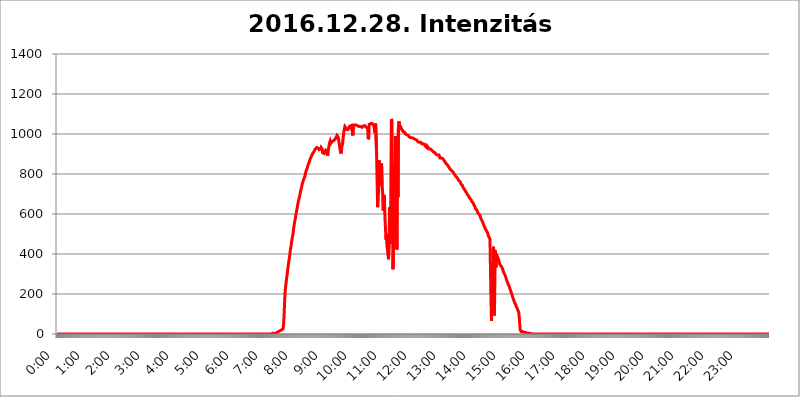
| Category | 2016.12.28. Intenzitás [W/m^2] |
|---|---|
| 0.0 | 0 |
| 0.0006944444444444445 | 0 |
| 0.001388888888888889 | 0 |
| 0.0020833333333333333 | 0 |
| 0.002777777777777778 | 0 |
| 0.003472222222222222 | 0 |
| 0.004166666666666667 | 0 |
| 0.004861111111111111 | 0 |
| 0.005555555555555556 | 0 |
| 0.0062499999999999995 | 0 |
| 0.006944444444444444 | 0 |
| 0.007638888888888889 | 0 |
| 0.008333333333333333 | 0 |
| 0.009027777777777779 | 0 |
| 0.009722222222222222 | 0 |
| 0.010416666666666666 | 0 |
| 0.011111111111111112 | 0 |
| 0.011805555555555555 | 0 |
| 0.012499999999999999 | 0 |
| 0.013194444444444444 | 0 |
| 0.013888888888888888 | 0 |
| 0.014583333333333332 | 0 |
| 0.015277777777777777 | 0 |
| 0.015972222222222224 | 0 |
| 0.016666666666666666 | 0 |
| 0.017361111111111112 | 0 |
| 0.018055555555555557 | 0 |
| 0.01875 | 0 |
| 0.019444444444444445 | 0 |
| 0.02013888888888889 | 0 |
| 0.020833333333333332 | 0 |
| 0.02152777777777778 | 0 |
| 0.022222222222222223 | 0 |
| 0.02291666666666667 | 0 |
| 0.02361111111111111 | 0 |
| 0.024305555555555556 | 0 |
| 0.024999999999999998 | 0 |
| 0.025694444444444447 | 0 |
| 0.02638888888888889 | 0 |
| 0.027083333333333334 | 0 |
| 0.027777777777777776 | 0 |
| 0.02847222222222222 | 0 |
| 0.029166666666666664 | 0 |
| 0.029861111111111113 | 0 |
| 0.030555555555555555 | 0 |
| 0.03125 | 0 |
| 0.03194444444444445 | 0 |
| 0.03263888888888889 | 0 |
| 0.03333333333333333 | 0 |
| 0.034027777777777775 | 0 |
| 0.034722222222222224 | 0 |
| 0.035416666666666666 | 0 |
| 0.036111111111111115 | 0 |
| 0.03680555555555556 | 0 |
| 0.0375 | 0 |
| 0.03819444444444444 | 0 |
| 0.03888888888888889 | 0 |
| 0.03958333333333333 | 0 |
| 0.04027777777777778 | 0 |
| 0.04097222222222222 | 0 |
| 0.041666666666666664 | 0 |
| 0.042361111111111106 | 0 |
| 0.04305555555555556 | 0 |
| 0.043750000000000004 | 0 |
| 0.044444444444444446 | 0 |
| 0.04513888888888889 | 0 |
| 0.04583333333333334 | 0 |
| 0.04652777777777778 | 0 |
| 0.04722222222222222 | 0 |
| 0.04791666666666666 | 0 |
| 0.04861111111111111 | 0 |
| 0.049305555555555554 | 0 |
| 0.049999999999999996 | 0 |
| 0.05069444444444445 | 0 |
| 0.051388888888888894 | 0 |
| 0.052083333333333336 | 0 |
| 0.05277777777777778 | 0 |
| 0.05347222222222222 | 0 |
| 0.05416666666666667 | 0 |
| 0.05486111111111111 | 0 |
| 0.05555555555555555 | 0 |
| 0.05625 | 0 |
| 0.05694444444444444 | 0 |
| 0.057638888888888885 | 0 |
| 0.05833333333333333 | 0 |
| 0.05902777777777778 | 0 |
| 0.059722222222222225 | 0 |
| 0.06041666666666667 | 0 |
| 0.061111111111111116 | 0 |
| 0.06180555555555556 | 0 |
| 0.0625 | 0 |
| 0.06319444444444444 | 0 |
| 0.06388888888888888 | 0 |
| 0.06458333333333334 | 0 |
| 0.06527777777777778 | 0 |
| 0.06597222222222222 | 0 |
| 0.06666666666666667 | 0 |
| 0.06736111111111111 | 0 |
| 0.06805555555555555 | 0 |
| 0.06874999999999999 | 0 |
| 0.06944444444444443 | 0 |
| 0.07013888888888889 | 0 |
| 0.07083333333333333 | 0 |
| 0.07152777777777779 | 0 |
| 0.07222222222222223 | 0 |
| 0.07291666666666667 | 0 |
| 0.07361111111111111 | 0 |
| 0.07430555555555556 | 0 |
| 0.075 | 0 |
| 0.07569444444444444 | 0 |
| 0.0763888888888889 | 0 |
| 0.07708333333333334 | 0 |
| 0.07777777777777778 | 0 |
| 0.07847222222222222 | 0 |
| 0.07916666666666666 | 0 |
| 0.0798611111111111 | 0 |
| 0.08055555555555556 | 0 |
| 0.08125 | 0 |
| 0.08194444444444444 | 0 |
| 0.08263888888888889 | 0 |
| 0.08333333333333333 | 0 |
| 0.08402777777777777 | 0 |
| 0.08472222222222221 | 0 |
| 0.08541666666666665 | 0 |
| 0.08611111111111112 | 0 |
| 0.08680555555555557 | 0 |
| 0.08750000000000001 | 0 |
| 0.08819444444444445 | 0 |
| 0.08888888888888889 | 0 |
| 0.08958333333333333 | 0 |
| 0.09027777777777778 | 0 |
| 0.09097222222222222 | 0 |
| 0.09166666666666667 | 0 |
| 0.09236111111111112 | 0 |
| 0.09305555555555556 | 0 |
| 0.09375 | 0 |
| 0.09444444444444444 | 0 |
| 0.09513888888888888 | 0 |
| 0.09583333333333333 | 0 |
| 0.09652777777777777 | 0 |
| 0.09722222222222222 | 0 |
| 0.09791666666666667 | 0 |
| 0.09861111111111111 | 0 |
| 0.09930555555555555 | 0 |
| 0.09999999999999999 | 0 |
| 0.10069444444444443 | 0 |
| 0.1013888888888889 | 0 |
| 0.10208333333333335 | 0 |
| 0.10277777777777779 | 0 |
| 0.10347222222222223 | 0 |
| 0.10416666666666667 | 0 |
| 0.10486111111111111 | 0 |
| 0.10555555555555556 | 0 |
| 0.10625 | 0 |
| 0.10694444444444444 | 0 |
| 0.1076388888888889 | 0 |
| 0.10833333333333334 | 0 |
| 0.10902777777777778 | 0 |
| 0.10972222222222222 | 0 |
| 0.1111111111111111 | 0 |
| 0.11180555555555556 | 0 |
| 0.11180555555555556 | 0 |
| 0.1125 | 0 |
| 0.11319444444444444 | 0 |
| 0.11388888888888889 | 0 |
| 0.11458333333333333 | 0 |
| 0.11527777777777777 | 0 |
| 0.11597222222222221 | 0 |
| 0.11666666666666665 | 0 |
| 0.1173611111111111 | 0 |
| 0.11805555555555557 | 0 |
| 0.11944444444444445 | 0 |
| 0.12013888888888889 | 0 |
| 0.12083333333333333 | 0 |
| 0.12152777777777778 | 0 |
| 0.12222222222222223 | 0 |
| 0.12291666666666667 | 0 |
| 0.12291666666666667 | 0 |
| 0.12361111111111112 | 0 |
| 0.12430555555555556 | 0 |
| 0.125 | 0 |
| 0.12569444444444444 | 0 |
| 0.12638888888888888 | 0 |
| 0.12708333333333333 | 0 |
| 0.16875 | 0 |
| 0.12847222222222224 | 0 |
| 0.12916666666666668 | 0 |
| 0.12986111111111112 | 0 |
| 0.13055555555555556 | 0 |
| 0.13125 | 0 |
| 0.13194444444444445 | 0 |
| 0.1326388888888889 | 0 |
| 0.13333333333333333 | 0 |
| 0.13402777777777777 | 0 |
| 0.13402777777777777 | 0 |
| 0.13472222222222222 | 0 |
| 0.13541666666666666 | 0 |
| 0.1361111111111111 | 0 |
| 0.13749999999999998 | 0 |
| 0.13819444444444443 | 0 |
| 0.1388888888888889 | 0 |
| 0.13958333333333334 | 0 |
| 0.14027777777777778 | 0 |
| 0.14097222222222222 | 0 |
| 0.14166666666666666 | 0 |
| 0.1423611111111111 | 0 |
| 0.14305555555555557 | 0 |
| 0.14375000000000002 | 0 |
| 0.14444444444444446 | 0 |
| 0.1451388888888889 | 0 |
| 0.1451388888888889 | 0 |
| 0.14652777777777778 | 0 |
| 0.14722222222222223 | 0 |
| 0.14791666666666667 | 0 |
| 0.1486111111111111 | 0 |
| 0.14930555555555555 | 0 |
| 0.15 | 0 |
| 0.15069444444444444 | 0 |
| 0.15138888888888888 | 0 |
| 0.15208333333333332 | 0 |
| 0.15277777777777776 | 0 |
| 0.15347222222222223 | 0 |
| 0.15416666666666667 | 0 |
| 0.15486111111111112 | 0 |
| 0.15555555555555556 | 0 |
| 0.15625 | 0 |
| 0.15694444444444444 | 0 |
| 0.15763888888888888 | 0 |
| 0.15833333333333333 | 0 |
| 0.15902777777777777 | 0 |
| 0.15972222222222224 | 0 |
| 0.16041666666666668 | 0 |
| 0.16111111111111112 | 0 |
| 0.16180555555555556 | 0 |
| 0.1625 | 0 |
| 0.16319444444444445 | 0 |
| 0.1638888888888889 | 0 |
| 0.16458333333333333 | 0 |
| 0.16527777777777777 | 0 |
| 0.16597222222222222 | 0 |
| 0.16666666666666666 | 0 |
| 0.1673611111111111 | 0 |
| 0.16805555555555554 | 0 |
| 0.16874999999999998 | 0 |
| 0.16944444444444443 | 0 |
| 0.17013888888888887 | 0 |
| 0.1708333333333333 | 0 |
| 0.17152777777777775 | 0 |
| 0.17222222222222225 | 0 |
| 0.1729166666666667 | 0 |
| 0.17361111111111113 | 0 |
| 0.17430555555555557 | 0 |
| 0.17500000000000002 | 0 |
| 0.17569444444444446 | 0 |
| 0.1763888888888889 | 0 |
| 0.17708333333333334 | 0 |
| 0.17777777777777778 | 0 |
| 0.17847222222222223 | 0 |
| 0.17916666666666667 | 0 |
| 0.1798611111111111 | 0 |
| 0.18055555555555555 | 0 |
| 0.18125 | 0 |
| 0.18194444444444444 | 0 |
| 0.1826388888888889 | 0 |
| 0.18333333333333335 | 0 |
| 0.1840277777777778 | 0 |
| 0.18472222222222223 | 0 |
| 0.18541666666666667 | 0 |
| 0.18611111111111112 | 0 |
| 0.18680555555555556 | 0 |
| 0.1875 | 0 |
| 0.18819444444444444 | 0 |
| 0.18888888888888888 | 0 |
| 0.18958333333333333 | 0 |
| 0.19027777777777777 | 0 |
| 0.1909722222222222 | 0 |
| 0.19166666666666665 | 0 |
| 0.19236111111111112 | 0 |
| 0.19305555555555554 | 0 |
| 0.19375 | 0 |
| 0.19444444444444445 | 0 |
| 0.1951388888888889 | 0 |
| 0.19583333333333333 | 0 |
| 0.19652777777777777 | 0 |
| 0.19722222222222222 | 0 |
| 0.19791666666666666 | 0 |
| 0.1986111111111111 | 0 |
| 0.19930555555555554 | 0 |
| 0.19999999999999998 | 0 |
| 0.20069444444444443 | 0 |
| 0.20138888888888887 | 0 |
| 0.2020833333333333 | 0 |
| 0.2027777777777778 | 0 |
| 0.2034722222222222 | 0 |
| 0.2041666666666667 | 0 |
| 0.20486111111111113 | 0 |
| 0.20555555555555557 | 0 |
| 0.20625000000000002 | 0 |
| 0.20694444444444446 | 0 |
| 0.2076388888888889 | 0 |
| 0.20833333333333334 | 0 |
| 0.20902777777777778 | 0 |
| 0.20972222222222223 | 0 |
| 0.21041666666666667 | 0 |
| 0.2111111111111111 | 0 |
| 0.21180555555555555 | 0 |
| 0.2125 | 0 |
| 0.21319444444444444 | 0 |
| 0.2138888888888889 | 0 |
| 0.21458333333333335 | 0 |
| 0.2152777777777778 | 0 |
| 0.21597222222222223 | 0 |
| 0.21666666666666667 | 0 |
| 0.21736111111111112 | 0 |
| 0.21805555555555556 | 0 |
| 0.21875 | 0 |
| 0.21944444444444444 | 0 |
| 0.22013888888888888 | 0 |
| 0.22083333333333333 | 0 |
| 0.22152777777777777 | 0 |
| 0.2222222222222222 | 0 |
| 0.22291666666666665 | 0 |
| 0.2236111111111111 | 0 |
| 0.22430555555555556 | 0 |
| 0.225 | 0 |
| 0.22569444444444445 | 0 |
| 0.2263888888888889 | 0 |
| 0.22708333333333333 | 0 |
| 0.22777777777777777 | 0 |
| 0.22847222222222222 | 0 |
| 0.22916666666666666 | 0 |
| 0.2298611111111111 | 0 |
| 0.23055555555555554 | 0 |
| 0.23124999999999998 | 0 |
| 0.23194444444444443 | 0 |
| 0.23263888888888887 | 0 |
| 0.2333333333333333 | 0 |
| 0.2340277777777778 | 0 |
| 0.2347222222222222 | 0 |
| 0.2354166666666667 | 0 |
| 0.23611111111111113 | 0 |
| 0.23680555555555557 | 0 |
| 0.23750000000000002 | 0 |
| 0.23819444444444446 | 0 |
| 0.2388888888888889 | 0 |
| 0.23958333333333334 | 0 |
| 0.24027777777777778 | 0 |
| 0.24097222222222223 | 0 |
| 0.24166666666666667 | 0 |
| 0.2423611111111111 | 0 |
| 0.24305555555555555 | 0 |
| 0.24375 | 0 |
| 0.24444444444444446 | 0 |
| 0.24513888888888888 | 0 |
| 0.24583333333333335 | 0 |
| 0.2465277777777778 | 0 |
| 0.24722222222222223 | 0 |
| 0.24791666666666667 | 0 |
| 0.24861111111111112 | 0 |
| 0.24930555555555556 | 0 |
| 0.25 | 0 |
| 0.25069444444444444 | 0 |
| 0.2513888888888889 | 0 |
| 0.2520833333333333 | 0 |
| 0.25277777777777777 | 0 |
| 0.2534722222222222 | 0 |
| 0.25416666666666665 | 0 |
| 0.2548611111111111 | 0 |
| 0.2555555555555556 | 0 |
| 0.25625000000000003 | 0 |
| 0.2569444444444445 | 0 |
| 0.2576388888888889 | 0 |
| 0.25833333333333336 | 0 |
| 0.2590277777777778 | 0 |
| 0.25972222222222224 | 0 |
| 0.2604166666666667 | 0 |
| 0.2611111111111111 | 0 |
| 0.26180555555555557 | 0 |
| 0.2625 | 0 |
| 0.26319444444444445 | 0 |
| 0.2638888888888889 | 0 |
| 0.26458333333333334 | 0 |
| 0.2652777777777778 | 0 |
| 0.2659722222222222 | 0 |
| 0.26666666666666666 | 0 |
| 0.2673611111111111 | 0 |
| 0.26805555555555555 | 0 |
| 0.26875 | 0 |
| 0.26944444444444443 | 0 |
| 0.2701388888888889 | 0 |
| 0.2708333333333333 | 0 |
| 0.27152777777777776 | 0 |
| 0.2722222222222222 | 0 |
| 0.27291666666666664 | 0 |
| 0.2736111111111111 | 0 |
| 0.2743055555555555 | 0 |
| 0.27499999999999997 | 0 |
| 0.27569444444444446 | 0 |
| 0.27638888888888885 | 0 |
| 0.27708333333333335 | 0 |
| 0.2777777777777778 | 0 |
| 0.27847222222222223 | 0 |
| 0.2791666666666667 | 0 |
| 0.2798611111111111 | 0 |
| 0.28055555555555556 | 0 |
| 0.28125 | 0 |
| 0.28194444444444444 | 0 |
| 0.2826388888888889 | 0 |
| 0.2833333333333333 | 0 |
| 0.28402777777777777 | 0 |
| 0.2847222222222222 | 0 |
| 0.28541666666666665 | 0 |
| 0.28611111111111115 | 0 |
| 0.28680555555555554 | 0 |
| 0.28750000000000003 | 0 |
| 0.2881944444444445 | 0 |
| 0.2888888888888889 | 0 |
| 0.28958333333333336 | 0 |
| 0.2902777777777778 | 0 |
| 0.29097222222222224 | 0 |
| 0.2916666666666667 | 0 |
| 0.2923611111111111 | 0 |
| 0.29305555555555557 | 0 |
| 0.29375 | 0 |
| 0.29444444444444445 | 0 |
| 0.2951388888888889 | 0 |
| 0.29583333333333334 | 0 |
| 0.2965277777777778 | 0 |
| 0.2972222222222222 | 0 |
| 0.29791666666666666 | 0 |
| 0.2986111111111111 | 0 |
| 0.29930555555555555 | 0 |
| 0.3 | 0 |
| 0.30069444444444443 | 3.525 |
| 0.3013888888888889 | 3.525 |
| 0.3020833333333333 | 3.525 |
| 0.30277777777777776 | 3.525 |
| 0.3034722222222222 | 3.525 |
| 0.30416666666666664 | 3.525 |
| 0.3048611111111111 | 3.525 |
| 0.3055555555555555 | 3.525 |
| 0.30624999999999997 | 3.525 |
| 0.3069444444444444 | 3.525 |
| 0.3076388888888889 | 7.887 |
| 0.30833333333333335 | 7.887 |
| 0.3090277777777778 | 7.887 |
| 0.30972222222222223 | 12.257 |
| 0.3104166666666667 | 12.257 |
| 0.3111111111111111 | 12.257 |
| 0.31180555555555556 | 12.257 |
| 0.3125 | 16.636 |
| 0.31319444444444444 | 16.636 |
| 0.3138888888888889 | 21.024 |
| 0.3145833333333333 | 21.024 |
| 0.31527777777777777 | 21.024 |
| 0.3159722222222222 | 25.419 |
| 0.31666666666666665 | 25.419 |
| 0.31736111111111115 | 43.079 |
| 0.31805555555555554 | 87.692 |
| 0.31875000000000003 | 146.423 |
| 0.3194444444444445 | 201.058 |
| 0.3201388888888889 | 233 |
| 0.32083333333333336 | 251.251 |
| 0.3215277777777778 | 274.047 |
| 0.32222222222222224 | 292.259 |
| 0.3229166666666667 | 310.44 |
| 0.3236111111111111 | 333.113 |
| 0.32430555555555557 | 351.198 |
| 0.325 | 369.23 |
| 0.32569444444444445 | 382.715 |
| 0.3263888888888889 | 405.108 |
| 0.32708333333333334 | 422.943 |
| 0.3277777777777778 | 436.27 |
| 0.3284722222222222 | 453.968 |
| 0.32916666666666666 | 471.582 |
| 0.3298611111111111 | 484.735 |
| 0.33055555555555555 | 497.836 |
| 0.33125 | 519.555 |
| 0.33194444444444443 | 536.82 |
| 0.3326388888888889 | 553.986 |
| 0.3333333333333333 | 566.793 |
| 0.3340277777777778 | 579.542 |
| 0.3347222222222222 | 596.45 |
| 0.3354166666666667 | 609.062 |
| 0.3361111111111111 | 621.613 |
| 0.3368055555555556 | 638.256 |
| 0.33749999999999997 | 650.667 |
| 0.33819444444444446 | 663.019 |
| 0.33888888888888885 | 675.311 |
| 0.33958333333333335 | 683.473 |
| 0.34027777777777773 | 695.666 |
| 0.34097222222222223 | 707.8 |
| 0.3416666666666666 | 719.877 |
| 0.3423611111111111 | 727.896 |
| 0.3430555555555555 | 739.877 |
| 0.34375 | 751.803 |
| 0.3444444444444445 | 759.723 |
| 0.3451388888888889 | 767.62 |
| 0.3458333333333334 | 775.492 |
| 0.34652777777777777 | 779.42 |
| 0.34722222222222227 | 787.258 |
| 0.34791666666666665 | 798.974 |
| 0.34861111111111115 | 810.641 |
| 0.34930555555555554 | 818.392 |
| 0.35000000000000003 | 822.26 |
| 0.3506944444444444 | 829.981 |
| 0.3513888888888889 | 841.526 |
| 0.3520833333333333 | 849.199 |
| 0.3527777777777778 | 853.029 |
| 0.3534722222222222 | 860.676 |
| 0.3541666666666667 | 868.305 |
| 0.3548611111111111 | 875.918 |
| 0.35555555555555557 | 879.719 |
| 0.35625 | 887.309 |
| 0.35694444444444445 | 891.099 |
| 0.3576388888888889 | 898.668 |
| 0.35833333333333334 | 902.447 |
| 0.3590277777777778 | 906.223 |
| 0.3597222222222222 | 909.996 |
| 0.36041666666666666 | 913.766 |
| 0.3611111111111111 | 913.766 |
| 0.36180555555555555 | 925.06 |
| 0.3625 | 925.06 |
| 0.36319444444444443 | 925.06 |
| 0.3638888888888889 | 932.576 |
| 0.3645833333333333 | 928.819 |
| 0.3652777777777778 | 932.576 |
| 0.3659722222222222 | 928.819 |
| 0.3666666666666667 | 925.06 |
| 0.3673611111111111 | 921.298 |
| 0.3680555555555556 | 917.534 |
| 0.36874999999999997 | 921.298 |
| 0.36944444444444446 | 925.06 |
| 0.37013888888888885 | 932.576 |
| 0.37083333333333335 | 928.819 |
| 0.37152777777777773 | 925.06 |
| 0.37222222222222223 | 906.223 |
| 0.3729166666666666 | 909.996 |
| 0.3736111111111111 | 906.223 |
| 0.3743055555555555 | 902.447 |
| 0.375 | 898.668 |
| 0.3756944444444445 | 906.223 |
| 0.3763888888888889 | 917.534 |
| 0.3770833333333334 | 921.298 |
| 0.37777777777777777 | 921.298 |
| 0.37847222222222227 | 906.223 |
| 0.37916666666666665 | 891.099 |
| 0.37986111111111115 | 909.996 |
| 0.38055555555555554 | 928.819 |
| 0.38125000000000003 | 928.819 |
| 0.3819444444444444 | 955.071 |
| 0.3826388888888889 | 962.555 |
| 0.3833333333333333 | 951.327 |
| 0.3840277777777778 | 947.58 |
| 0.3847222222222222 | 955.071 |
| 0.3854166666666667 | 962.555 |
| 0.3861111111111111 | 966.295 |
| 0.38680555555555557 | 966.295 |
| 0.3875 | 966.295 |
| 0.38819444444444445 | 966.295 |
| 0.3888888888888889 | 970.034 |
| 0.38958333333333334 | 973.772 |
| 0.3902777777777778 | 977.508 |
| 0.3909722222222222 | 981.244 |
| 0.39166666666666666 | 984.98 |
| 0.3923611111111111 | 992.448 |
| 0.39305555555555555 | 992.448 |
| 0.39375 | 984.98 |
| 0.39444444444444443 | 977.508 |
| 0.3951388888888889 | 958.814 |
| 0.3958333333333333 | 943.832 |
| 0.3965277777777778 | 925.06 |
| 0.3972222222222222 | 909.996 |
| 0.3979166666666667 | 902.447 |
| 0.3986111111111111 | 917.534 |
| 0.3993055555555556 | 940.082 |
| 0.39999999999999997 | 947.58 |
| 0.40069444444444446 | 970.034 |
| 0.40138888888888885 | 992.448 |
| 0.40208333333333335 | 1014.852 |
| 0.40277777777777773 | 1026.06 |
| 0.40347222222222223 | 1037.277 |
| 0.4041666666666666 | 1041.019 |
| 0.4048611111111111 | 1029.798 |
| 0.4055555555555555 | 1022.323 |
| 0.40625 | 1022.323 |
| 0.4069444444444445 | 1022.323 |
| 0.4076388888888889 | 1022.323 |
| 0.4083333333333334 | 1022.323 |
| 0.40902777777777777 | 1026.06 |
| 0.40972222222222227 | 1037.277 |
| 0.41041666666666665 | 1037.277 |
| 0.41111111111111115 | 1037.277 |
| 0.41180555555555554 | 1041.019 |
| 0.41250000000000003 | 1037.277 |
| 0.4131944444444444 | 1044.762 |
| 0.4138888888888889 | 1011.118 |
| 0.4145833333333333 | 992.448 |
| 0.4152777777777778 | 1044.762 |
| 0.4159722222222222 | 1048.508 |
| 0.4166666666666667 | 1048.508 |
| 0.4173611111111111 | 1044.762 |
| 0.41805555555555557 | 1044.762 |
| 0.41875 | 1044.762 |
| 0.41944444444444445 | 1044.762 |
| 0.4201388888888889 | 1044.762 |
| 0.42083333333333334 | 1041.019 |
| 0.4215277777777778 | 1041.019 |
| 0.4222222222222222 | 1037.277 |
| 0.42291666666666666 | 1037.277 |
| 0.4236111111111111 | 1037.277 |
| 0.42430555555555555 | 1033.537 |
| 0.425 | 1033.537 |
| 0.42569444444444443 | 1037.277 |
| 0.4263888888888889 | 1037.277 |
| 0.4270833333333333 | 1033.537 |
| 0.4277777777777778 | 1033.537 |
| 0.4284722222222222 | 1037.277 |
| 0.4291666666666667 | 1037.277 |
| 0.4298611111111111 | 1041.019 |
| 0.4305555555555556 | 1037.277 |
| 0.43124999999999997 | 1044.762 |
| 0.43194444444444446 | 1041.019 |
| 0.43263888888888885 | 1037.277 |
| 0.43333333333333335 | 1033.537 |
| 0.43402777777777773 | 1037.277 |
| 0.43472222222222223 | 1037.277 |
| 0.4354166666666666 | 1029.798 |
| 0.4361111111111111 | 973.772 |
| 0.4368055555555555 | 981.244 |
| 0.4375 | 1048.508 |
| 0.4381944444444445 | 1044.762 |
| 0.4388888888888889 | 1044.762 |
| 0.4395833333333334 | 1052.255 |
| 0.44027777777777777 | 1056.004 |
| 0.44097222222222227 | 1052.255 |
| 0.44166666666666665 | 1052.255 |
| 0.44236111111111115 | 1052.255 |
| 0.44305555555555554 | 1044.762 |
| 0.44375000000000003 | 1048.508 |
| 0.4444444444444444 | 1037.277 |
| 0.4451388888888889 | 1007.383 |
| 0.4458333333333333 | 1037.277 |
| 0.4465277777777778 | 1052.255 |
| 0.4472222222222222 | 1052.255 |
| 0.4479166666666667 | 902.447 |
| 0.4486111111111111 | 759.723 |
| 0.44930555555555557 | 634.105 |
| 0.45 | 683.473 |
| 0.45069444444444445 | 711.832 |
| 0.4513888888888889 | 868.305 |
| 0.45208333333333334 | 845.365 |
| 0.4527777777777778 | 833.834 |
| 0.4534722222222222 | 739.877 |
| 0.45416666666666666 | 779.42 |
| 0.4548611111111111 | 853.029 |
| 0.45555555555555555 | 747.834 |
| 0.45625 | 715.858 |
| 0.45694444444444443 | 617.436 |
| 0.4576388888888889 | 625.784 |
| 0.4583333333333333 | 695.666 |
| 0.4590277777777778 | 658.909 |
| 0.4597222222222222 | 575.299 |
| 0.4604166666666667 | 523.88 |
| 0.4611111111111111 | 471.582 |
| 0.4618055555555556 | 497.836 |
| 0.46249999999999997 | 497.836 |
| 0.46319444444444446 | 418.492 |
| 0.46388888888888885 | 396.164 |
| 0.46458333333333335 | 373.729 |
| 0.46527777777777773 | 445.129 |
| 0.46597222222222223 | 634.105 |
| 0.4666666666666666 | 449.551 |
| 0.4673611111111111 | 629.948 |
| 0.4680555555555555 | 609.062 |
| 0.46875 | 1074.789 |
| 0.4694444444444445 | 1067.267 |
| 0.4701388888888889 | 642.4 |
| 0.4708333333333334 | 324.052 |
| 0.47152777777777777 | 409.574 |
| 0.47222222222222227 | 497.836 |
| 0.47291666666666665 | 841.526 |
| 0.47361111111111115 | 743.859 |
| 0.47430555555555554 | 988.714 |
| 0.47500000000000003 | 909.996 |
| 0.4756944444444444 | 545.416 |
| 0.4763888888888889 | 422.943 |
| 0.4770833333333333 | 970.034 |
| 0.4777777777777778 | 683.473 |
| 0.4784722222222222 | 1029.798 |
| 0.4791666666666667 | 1063.51 |
| 0.4798611111111111 | 1048.508 |
| 0.48055555555555557 | 1041.019 |
| 0.48125 | 1037.277 |
| 0.48194444444444445 | 1033.537 |
| 0.4826388888888889 | 1026.06 |
| 0.48333333333333334 | 1022.323 |
| 0.4840277777777778 | 1018.587 |
| 0.4847222222222222 | 1014.852 |
| 0.48541666666666666 | 1011.118 |
| 0.4861111111111111 | 1007.383 |
| 0.48680555555555555 | 1007.383 |
| 0.4875 | 1007.383 |
| 0.48819444444444443 | 999.916 |
| 0.4888888888888889 | 996.182 |
| 0.4895833333333333 | 996.182 |
| 0.4902777777777778 | 996.182 |
| 0.4909722222222222 | 992.448 |
| 0.4916666666666667 | 992.448 |
| 0.4923611111111111 | 992.448 |
| 0.4930555555555556 | 988.714 |
| 0.49374999999999997 | 984.98 |
| 0.49444444444444446 | 984.98 |
| 0.49513888888888885 | 984.98 |
| 0.49583333333333335 | 981.244 |
| 0.49652777777777773 | 981.244 |
| 0.49722222222222223 | 981.244 |
| 0.4979166666666666 | 981.244 |
| 0.4986111111111111 | 977.508 |
| 0.4993055555555555 | 977.508 |
| 0.5 | 977.508 |
| 0.5006944444444444 | 973.772 |
| 0.5013888888888889 | 977.508 |
| 0.5020833333333333 | 973.772 |
| 0.5027777777777778 | 970.034 |
| 0.5034722222222222 | 970.034 |
| 0.5041666666666667 | 970.034 |
| 0.5048611111111111 | 966.295 |
| 0.5055555555555555 | 962.555 |
| 0.50625 | 958.814 |
| 0.5069444444444444 | 958.814 |
| 0.5076388888888889 | 958.814 |
| 0.5083333333333333 | 958.814 |
| 0.5090277777777777 | 962.555 |
| 0.5097222222222222 | 958.814 |
| 0.5104166666666666 | 955.071 |
| 0.5111111111111112 | 951.327 |
| 0.5118055555555555 | 951.327 |
| 0.5125000000000001 | 951.327 |
| 0.5131944444444444 | 951.327 |
| 0.513888888888889 | 951.327 |
| 0.5145833333333333 | 947.58 |
| 0.5152777777777778 | 947.58 |
| 0.5159722222222222 | 940.082 |
| 0.5166666666666667 | 940.082 |
| 0.517361111111111 | 936.33 |
| 0.5180555555555556 | 932.576 |
| 0.5187499999999999 | 940.082 |
| 0.5194444444444445 | 940.082 |
| 0.5201388888888888 | 932.576 |
| 0.5208333333333334 | 928.819 |
| 0.5215277777777778 | 925.06 |
| 0.5222222222222223 | 925.06 |
| 0.5229166666666667 | 925.06 |
| 0.5236111111111111 | 925.06 |
| 0.5243055555555556 | 928.819 |
| 0.525 | 925.06 |
| 0.5256944444444445 | 917.534 |
| 0.5263888888888889 | 913.766 |
| 0.5270833333333333 | 913.766 |
| 0.5277777777777778 | 909.996 |
| 0.5284722222222222 | 909.996 |
| 0.5291666666666667 | 913.766 |
| 0.5298611111111111 | 906.223 |
| 0.5305555555555556 | 902.447 |
| 0.53125 | 898.668 |
| 0.5319444444444444 | 902.447 |
| 0.5326388888888889 | 894.885 |
| 0.5333333333333333 | 894.885 |
| 0.5340277777777778 | 891.099 |
| 0.5347222222222222 | 894.885 |
| 0.5354166666666667 | 894.885 |
| 0.5361111111111111 | 887.309 |
| 0.5368055555555555 | 879.719 |
| 0.5375 | 879.719 |
| 0.5381944444444444 | 879.719 |
| 0.5388888888888889 | 879.719 |
| 0.5395833333333333 | 875.918 |
| 0.5402777777777777 | 875.918 |
| 0.5409722222222222 | 875.918 |
| 0.5416666666666666 | 872.114 |
| 0.5423611111111112 | 868.305 |
| 0.5430555555555555 | 864.493 |
| 0.5437500000000001 | 860.676 |
| 0.5444444444444444 | 856.855 |
| 0.545138888888889 | 853.029 |
| 0.5458333333333333 | 853.029 |
| 0.5465277777777778 | 849.199 |
| 0.5472222222222222 | 845.365 |
| 0.5479166666666667 | 841.526 |
| 0.548611111111111 | 841.526 |
| 0.5493055555555556 | 833.834 |
| 0.5499999999999999 | 829.981 |
| 0.5506944444444445 | 826.123 |
| 0.5513888888888888 | 826.123 |
| 0.5520833333333334 | 822.26 |
| 0.5527777777777778 | 818.392 |
| 0.5534722222222223 | 814.519 |
| 0.5541666666666667 | 814.519 |
| 0.5548611111111111 | 810.641 |
| 0.5555555555555556 | 806.757 |
| 0.55625 | 802.868 |
| 0.5569444444444445 | 798.974 |
| 0.5576388888888889 | 798.974 |
| 0.5583333333333333 | 791.169 |
| 0.5590277777777778 | 787.258 |
| 0.5597222222222222 | 787.258 |
| 0.5604166666666667 | 783.342 |
| 0.5611111111111111 | 779.42 |
| 0.5618055555555556 | 775.492 |
| 0.5625 | 775.492 |
| 0.5631944444444444 | 767.62 |
| 0.5638888888888889 | 767.62 |
| 0.5645833333333333 | 763.674 |
| 0.5652777777777778 | 759.723 |
| 0.5659722222222222 | 751.803 |
| 0.5666666666666667 | 747.834 |
| 0.5673611111111111 | 747.834 |
| 0.5680555555555555 | 743.859 |
| 0.56875 | 735.89 |
| 0.5694444444444444 | 735.89 |
| 0.5701388888888889 | 727.896 |
| 0.5708333333333333 | 723.889 |
| 0.5715277777777777 | 719.877 |
| 0.5722222222222222 | 715.858 |
| 0.5729166666666666 | 711.832 |
| 0.5736111111111112 | 711.832 |
| 0.5743055555555555 | 703.762 |
| 0.5750000000000001 | 699.717 |
| 0.5756944444444444 | 695.666 |
| 0.576388888888889 | 691.608 |
| 0.5770833333333333 | 687.544 |
| 0.5777777777777778 | 683.473 |
| 0.5784722222222222 | 679.395 |
| 0.5791666666666667 | 675.311 |
| 0.579861111111111 | 675.311 |
| 0.5805555555555556 | 671.22 |
| 0.5812499999999999 | 663.019 |
| 0.5819444444444445 | 663.019 |
| 0.5826388888888888 | 658.909 |
| 0.5833333333333334 | 654.791 |
| 0.5840277777777778 | 650.667 |
| 0.5847222222222223 | 642.4 |
| 0.5854166666666667 | 638.256 |
| 0.5861111111111111 | 634.105 |
| 0.5868055555555556 | 625.784 |
| 0.5875 | 629.948 |
| 0.5881944444444445 | 625.784 |
| 0.5888888888888889 | 617.436 |
| 0.5895833333333333 | 609.062 |
| 0.5902777777777778 | 604.864 |
| 0.5909722222222222 | 600.661 |
| 0.5916666666666667 | 600.661 |
| 0.5923611111111111 | 600.661 |
| 0.5930555555555556 | 592.233 |
| 0.59375 | 579.542 |
| 0.5944444444444444 | 579.542 |
| 0.5951388888888889 | 575.299 |
| 0.5958333333333333 | 566.793 |
| 0.5965277777777778 | 562.53 |
| 0.5972222222222222 | 553.986 |
| 0.5979166666666667 | 545.416 |
| 0.5986111111111111 | 541.121 |
| 0.5993055555555555 | 536.82 |
| 0.6 | 528.2 |
| 0.6006944444444444 | 523.88 |
| 0.6013888888888889 | 523.88 |
| 0.6020833333333333 | 515.223 |
| 0.6027777777777777 | 510.885 |
| 0.6034722222222222 | 506.542 |
| 0.6041666666666666 | 502.192 |
| 0.6048611111111112 | 489.108 |
| 0.6055555555555555 | 489.108 |
| 0.6062500000000001 | 480.356 |
| 0.6069444444444444 | 471.582 |
| 0.607638888888889 | 467.187 |
| 0.6083333333333333 | 164.605 |
| 0.6090277777777778 | 65.31 |
| 0.6097222222222222 | 246.689 |
| 0.6104166666666667 | 160.056 |
| 0.611111111111111 | 278.603 |
| 0.6118055555555556 | 436.27 |
| 0.6124999999999999 | 400.638 |
| 0.6131944444444445 | 92.184 |
| 0.6138888888888888 | 418.492 |
| 0.6145833333333334 | 409.574 |
| 0.6152777777777778 | 333.113 |
| 0.6159722222222223 | 396.164 |
| 0.6166666666666667 | 391.685 |
| 0.6173611111111111 | 387.202 |
| 0.6180555555555556 | 382.715 |
| 0.61875 | 373.729 |
| 0.6194444444444445 | 364.728 |
| 0.6201388888888889 | 360.221 |
| 0.6208333333333333 | 346.682 |
| 0.6215277777777778 | 346.682 |
| 0.6222222222222222 | 342.162 |
| 0.6229166666666667 | 337.639 |
| 0.6236111111111111 | 333.113 |
| 0.6243055555555556 | 328.584 |
| 0.625 | 319.517 |
| 0.6256944444444444 | 314.98 |
| 0.6263888888888889 | 305.898 |
| 0.6270833333333333 | 305.898 |
| 0.6277777777777778 | 296.808 |
| 0.6284722222222222 | 292.259 |
| 0.6291666666666667 | 283.156 |
| 0.6298611111111111 | 274.047 |
| 0.6305555555555555 | 269.49 |
| 0.63125 | 260.373 |
| 0.6319444444444444 | 255.813 |
| 0.6326388888888889 | 246.689 |
| 0.6333333333333333 | 242.127 |
| 0.6340277777777777 | 237.564 |
| 0.6347222222222222 | 228.436 |
| 0.6354166666666666 | 223.873 |
| 0.6361111111111112 | 214.746 |
| 0.6368055555555555 | 205.62 |
| 0.6375000000000001 | 201.058 |
| 0.6381944444444444 | 191.937 |
| 0.638888888888889 | 182.82 |
| 0.6395833333333333 | 178.264 |
| 0.6402777777777778 | 169.156 |
| 0.6409722222222222 | 164.605 |
| 0.6416666666666667 | 155.509 |
| 0.642361111111111 | 150.964 |
| 0.6430555555555556 | 146.423 |
| 0.6437499999999999 | 137.347 |
| 0.6444444444444445 | 132.814 |
| 0.6451388888888888 | 128.284 |
| 0.6458333333333334 | 119.235 |
| 0.6465277777777778 | 114.716 |
| 0.6472222222222223 | 110.201 |
| 0.6479166666666667 | 87.692 |
| 0.6486111111111111 | 51.951 |
| 0.6493055555555556 | 21.024 |
| 0.65 | 16.636 |
| 0.6506944444444445 | 12.257 |
| 0.6513888888888889 | 12.257 |
| 0.6520833333333333 | 12.257 |
| 0.6527777777777778 | 12.257 |
| 0.6534722222222222 | 12.257 |
| 0.6541666666666667 | 12.257 |
| 0.6548611111111111 | 7.887 |
| 0.6555555555555556 | 7.887 |
| 0.65625 | 7.887 |
| 0.6569444444444444 | 7.887 |
| 0.6576388888888889 | 3.525 |
| 0.6583333333333333 | 3.525 |
| 0.6590277777777778 | 3.525 |
| 0.6597222222222222 | 3.525 |
| 0.6604166666666667 | 3.525 |
| 0.6611111111111111 | 3.525 |
| 0.6618055555555555 | 3.525 |
| 0.6625 | 0 |
| 0.6631944444444444 | 3.525 |
| 0.6638888888888889 | 3.525 |
| 0.6645833333333333 | 0 |
| 0.6652777777777777 | 0 |
| 0.6659722222222222 | 0 |
| 0.6666666666666666 | 0 |
| 0.6673611111111111 | 0 |
| 0.6680555555555556 | 0 |
| 0.6687500000000001 | 0 |
| 0.6694444444444444 | 0 |
| 0.6701388888888888 | 0 |
| 0.6708333333333334 | 0 |
| 0.6715277777777778 | 0 |
| 0.6722222222222222 | 0 |
| 0.6729166666666666 | 0 |
| 0.6736111111111112 | 0 |
| 0.6743055555555556 | 0 |
| 0.6749999999999999 | 0 |
| 0.6756944444444444 | 0 |
| 0.6763888888888889 | 0 |
| 0.6770833333333334 | 0 |
| 0.6777777777777777 | 0 |
| 0.6784722222222223 | 0 |
| 0.6791666666666667 | 0 |
| 0.6798611111111111 | 0 |
| 0.6805555555555555 | 0 |
| 0.68125 | 0 |
| 0.6819444444444445 | 0 |
| 0.6826388888888889 | 0 |
| 0.6833333333333332 | 0 |
| 0.6840277777777778 | 0 |
| 0.6847222222222222 | 0 |
| 0.6854166666666667 | 0 |
| 0.686111111111111 | 0 |
| 0.6868055555555556 | 0 |
| 0.6875 | 0 |
| 0.6881944444444444 | 0 |
| 0.688888888888889 | 0 |
| 0.6895833333333333 | 0 |
| 0.6902777777777778 | 0 |
| 0.6909722222222222 | 0 |
| 0.6916666666666668 | 0 |
| 0.6923611111111111 | 0 |
| 0.6930555555555555 | 0 |
| 0.69375 | 0 |
| 0.6944444444444445 | 0 |
| 0.6951388888888889 | 0 |
| 0.6958333333333333 | 0 |
| 0.6965277777777777 | 0 |
| 0.6972222222222223 | 0 |
| 0.6979166666666666 | 0 |
| 0.6986111111111111 | 0 |
| 0.6993055555555556 | 0 |
| 0.7000000000000001 | 0 |
| 0.7006944444444444 | 0 |
| 0.7013888888888888 | 0 |
| 0.7020833333333334 | 0 |
| 0.7027777777777778 | 0 |
| 0.7034722222222222 | 0 |
| 0.7041666666666666 | 0 |
| 0.7048611111111112 | 0 |
| 0.7055555555555556 | 0 |
| 0.7062499999999999 | 0 |
| 0.7069444444444444 | 0 |
| 0.7076388888888889 | 0 |
| 0.7083333333333334 | 0 |
| 0.7090277777777777 | 0 |
| 0.7097222222222223 | 0 |
| 0.7104166666666667 | 0 |
| 0.7111111111111111 | 0 |
| 0.7118055555555555 | 0 |
| 0.7125 | 0 |
| 0.7131944444444445 | 0 |
| 0.7138888888888889 | 0 |
| 0.7145833333333332 | 0 |
| 0.7152777777777778 | 0 |
| 0.7159722222222222 | 0 |
| 0.7166666666666667 | 0 |
| 0.717361111111111 | 0 |
| 0.7180555555555556 | 0 |
| 0.71875 | 0 |
| 0.7194444444444444 | 0 |
| 0.720138888888889 | 0 |
| 0.7208333333333333 | 0 |
| 0.7215277777777778 | 0 |
| 0.7222222222222222 | 0 |
| 0.7229166666666668 | 0 |
| 0.7236111111111111 | 0 |
| 0.7243055555555555 | 0 |
| 0.725 | 0 |
| 0.7256944444444445 | 0 |
| 0.7263888888888889 | 0 |
| 0.7270833333333333 | 0 |
| 0.7277777777777777 | 0 |
| 0.7284722222222223 | 0 |
| 0.7291666666666666 | 0 |
| 0.7298611111111111 | 0 |
| 0.7305555555555556 | 0 |
| 0.7312500000000001 | 0 |
| 0.7319444444444444 | 0 |
| 0.7326388888888888 | 0 |
| 0.7333333333333334 | 0 |
| 0.7340277777777778 | 0 |
| 0.7347222222222222 | 0 |
| 0.7354166666666666 | 0 |
| 0.7361111111111112 | 0 |
| 0.7368055555555556 | 0 |
| 0.7374999999999999 | 0 |
| 0.7381944444444444 | 0 |
| 0.7388888888888889 | 0 |
| 0.7395833333333334 | 0 |
| 0.7402777777777777 | 0 |
| 0.7409722222222223 | 0 |
| 0.7416666666666667 | 0 |
| 0.7423611111111111 | 0 |
| 0.7430555555555555 | 0 |
| 0.74375 | 0 |
| 0.7444444444444445 | 0 |
| 0.7451388888888889 | 0 |
| 0.7458333333333332 | 0 |
| 0.7465277777777778 | 0 |
| 0.7472222222222222 | 0 |
| 0.7479166666666667 | 0 |
| 0.748611111111111 | 0 |
| 0.7493055555555556 | 0 |
| 0.75 | 0 |
| 0.7506944444444444 | 0 |
| 0.751388888888889 | 0 |
| 0.7520833333333333 | 0 |
| 0.7527777777777778 | 0 |
| 0.7534722222222222 | 0 |
| 0.7541666666666668 | 0 |
| 0.7548611111111111 | 0 |
| 0.7555555555555555 | 0 |
| 0.75625 | 0 |
| 0.7569444444444445 | 0 |
| 0.7576388888888889 | 0 |
| 0.7583333333333333 | 0 |
| 0.7590277777777777 | 0 |
| 0.7597222222222223 | 0 |
| 0.7604166666666666 | 0 |
| 0.7611111111111111 | 0 |
| 0.7618055555555556 | 0 |
| 0.7625000000000001 | 0 |
| 0.7631944444444444 | 0 |
| 0.7638888888888888 | 0 |
| 0.7645833333333334 | 0 |
| 0.7652777777777778 | 0 |
| 0.7659722222222222 | 0 |
| 0.7666666666666666 | 0 |
| 0.7673611111111112 | 0 |
| 0.7680555555555556 | 0 |
| 0.7687499999999999 | 0 |
| 0.7694444444444444 | 0 |
| 0.7701388888888889 | 0 |
| 0.7708333333333334 | 0 |
| 0.7715277777777777 | 0 |
| 0.7722222222222223 | 0 |
| 0.7729166666666667 | 0 |
| 0.7736111111111111 | 0 |
| 0.7743055555555555 | 0 |
| 0.775 | 0 |
| 0.7756944444444445 | 0 |
| 0.7763888888888889 | 0 |
| 0.7770833333333332 | 0 |
| 0.7777777777777778 | 0 |
| 0.7784722222222222 | 0 |
| 0.7791666666666667 | 0 |
| 0.779861111111111 | 0 |
| 0.7805555555555556 | 0 |
| 0.78125 | 0 |
| 0.7819444444444444 | 0 |
| 0.782638888888889 | 0 |
| 0.7833333333333333 | 0 |
| 0.7840277777777778 | 0 |
| 0.7847222222222222 | 0 |
| 0.7854166666666668 | 0 |
| 0.7861111111111111 | 0 |
| 0.7868055555555555 | 0 |
| 0.7875 | 0 |
| 0.7881944444444445 | 0 |
| 0.7888888888888889 | 0 |
| 0.7895833333333333 | 0 |
| 0.7902777777777777 | 0 |
| 0.7909722222222223 | 0 |
| 0.7916666666666666 | 0 |
| 0.7923611111111111 | 0 |
| 0.7930555555555556 | 0 |
| 0.7937500000000001 | 0 |
| 0.7944444444444444 | 0 |
| 0.7951388888888888 | 0 |
| 0.7958333333333334 | 0 |
| 0.7965277777777778 | 0 |
| 0.7972222222222222 | 0 |
| 0.7979166666666666 | 0 |
| 0.7986111111111112 | 0 |
| 0.7993055555555556 | 0 |
| 0.7999999999999999 | 0 |
| 0.8006944444444444 | 0 |
| 0.8013888888888889 | 0 |
| 0.8020833333333334 | 0 |
| 0.8027777777777777 | 0 |
| 0.8034722222222223 | 0 |
| 0.8041666666666667 | 0 |
| 0.8048611111111111 | 0 |
| 0.8055555555555555 | 0 |
| 0.80625 | 0 |
| 0.8069444444444445 | 0 |
| 0.8076388888888889 | 0 |
| 0.8083333333333332 | 0 |
| 0.8090277777777778 | 0 |
| 0.8097222222222222 | 0 |
| 0.8104166666666667 | 0 |
| 0.811111111111111 | 0 |
| 0.8118055555555556 | 0 |
| 0.8125 | 0 |
| 0.8131944444444444 | 0 |
| 0.813888888888889 | 0 |
| 0.8145833333333333 | 0 |
| 0.8152777777777778 | 0 |
| 0.8159722222222222 | 0 |
| 0.8166666666666668 | 0 |
| 0.8173611111111111 | 0 |
| 0.8180555555555555 | 0 |
| 0.81875 | 0 |
| 0.8194444444444445 | 0 |
| 0.8201388888888889 | 0 |
| 0.8208333333333333 | 0 |
| 0.8215277777777777 | 0 |
| 0.8222222222222223 | 0 |
| 0.8229166666666666 | 0 |
| 0.8236111111111111 | 0 |
| 0.8243055555555556 | 0 |
| 0.8250000000000001 | 0 |
| 0.8256944444444444 | 0 |
| 0.8263888888888888 | 0 |
| 0.8270833333333334 | 0 |
| 0.8277777777777778 | 0 |
| 0.8284722222222222 | 0 |
| 0.8291666666666666 | 0 |
| 0.8298611111111112 | 0 |
| 0.8305555555555556 | 0 |
| 0.8312499999999999 | 0 |
| 0.8319444444444444 | 0 |
| 0.8326388888888889 | 0 |
| 0.8333333333333334 | 0 |
| 0.8340277777777777 | 0 |
| 0.8347222222222223 | 0 |
| 0.8354166666666667 | 0 |
| 0.8361111111111111 | 0 |
| 0.8368055555555555 | 0 |
| 0.8375 | 0 |
| 0.8381944444444445 | 0 |
| 0.8388888888888889 | 0 |
| 0.8395833333333332 | 0 |
| 0.8402777777777778 | 0 |
| 0.8409722222222222 | 0 |
| 0.8416666666666667 | 0 |
| 0.842361111111111 | 0 |
| 0.8430555555555556 | 0 |
| 0.84375 | 0 |
| 0.8444444444444444 | 0 |
| 0.845138888888889 | 0 |
| 0.8458333333333333 | 0 |
| 0.8465277777777778 | 0 |
| 0.8472222222222222 | 0 |
| 0.8479166666666668 | 0 |
| 0.8486111111111111 | 0 |
| 0.8493055555555555 | 0 |
| 0.85 | 0 |
| 0.8506944444444445 | 0 |
| 0.8513888888888889 | 0 |
| 0.8520833333333333 | 0 |
| 0.8527777777777777 | 0 |
| 0.8534722222222223 | 0 |
| 0.8541666666666666 | 0 |
| 0.8548611111111111 | 0 |
| 0.8555555555555556 | 0 |
| 0.8562500000000001 | 0 |
| 0.8569444444444444 | 0 |
| 0.8576388888888888 | 0 |
| 0.8583333333333334 | 0 |
| 0.8590277777777778 | 0 |
| 0.8597222222222222 | 0 |
| 0.8604166666666666 | 0 |
| 0.8611111111111112 | 0 |
| 0.8618055555555556 | 0 |
| 0.8624999999999999 | 0 |
| 0.8631944444444444 | 0 |
| 0.8638888888888889 | 0 |
| 0.8645833333333334 | 0 |
| 0.8652777777777777 | 0 |
| 0.8659722222222223 | 0 |
| 0.8666666666666667 | 0 |
| 0.8673611111111111 | 0 |
| 0.8680555555555555 | 0 |
| 0.86875 | 0 |
| 0.8694444444444445 | 0 |
| 0.8701388888888889 | 0 |
| 0.8708333333333332 | 0 |
| 0.8715277777777778 | 0 |
| 0.8722222222222222 | 0 |
| 0.8729166666666667 | 0 |
| 0.873611111111111 | 0 |
| 0.8743055555555556 | 0 |
| 0.875 | 0 |
| 0.8756944444444444 | 0 |
| 0.876388888888889 | 0 |
| 0.8770833333333333 | 0 |
| 0.8777777777777778 | 0 |
| 0.8784722222222222 | 0 |
| 0.8791666666666668 | 0 |
| 0.8798611111111111 | 0 |
| 0.8805555555555555 | 0 |
| 0.88125 | 0 |
| 0.8819444444444445 | 0 |
| 0.8826388888888889 | 0 |
| 0.8833333333333333 | 0 |
| 0.8840277777777777 | 0 |
| 0.8847222222222223 | 0 |
| 0.8854166666666666 | 0 |
| 0.8861111111111111 | 0 |
| 0.8868055555555556 | 0 |
| 0.8875000000000001 | 0 |
| 0.8881944444444444 | 0 |
| 0.8888888888888888 | 0 |
| 0.8895833333333334 | 0 |
| 0.8902777777777778 | 0 |
| 0.8909722222222222 | 0 |
| 0.8916666666666666 | 0 |
| 0.8923611111111112 | 0 |
| 0.8930555555555556 | 0 |
| 0.8937499999999999 | 0 |
| 0.8944444444444444 | 0 |
| 0.8951388888888889 | 0 |
| 0.8958333333333334 | 0 |
| 0.8965277777777777 | 0 |
| 0.8972222222222223 | 0 |
| 0.8979166666666667 | 0 |
| 0.8986111111111111 | 0 |
| 0.8993055555555555 | 0 |
| 0.9 | 0 |
| 0.9006944444444445 | 0 |
| 0.9013888888888889 | 0 |
| 0.9020833333333332 | 0 |
| 0.9027777777777778 | 0 |
| 0.9034722222222222 | 0 |
| 0.9041666666666667 | 0 |
| 0.904861111111111 | 0 |
| 0.9055555555555556 | 0 |
| 0.90625 | 0 |
| 0.9069444444444444 | 0 |
| 0.907638888888889 | 0 |
| 0.9083333333333333 | 0 |
| 0.9090277777777778 | 0 |
| 0.9097222222222222 | 0 |
| 0.9104166666666668 | 0 |
| 0.9111111111111111 | 0 |
| 0.9118055555555555 | 0 |
| 0.9125 | 0 |
| 0.9131944444444445 | 0 |
| 0.9138888888888889 | 0 |
| 0.9145833333333333 | 0 |
| 0.9152777777777777 | 0 |
| 0.9159722222222223 | 0 |
| 0.9166666666666666 | 0 |
| 0.9173611111111111 | 0 |
| 0.9180555555555556 | 0 |
| 0.9187500000000001 | 0 |
| 0.9194444444444444 | 0 |
| 0.9201388888888888 | 0 |
| 0.9208333333333334 | 0 |
| 0.9215277777777778 | 0 |
| 0.9222222222222222 | 0 |
| 0.9229166666666666 | 0 |
| 0.9236111111111112 | 0 |
| 0.9243055555555556 | 0 |
| 0.9249999999999999 | 0 |
| 0.9256944444444444 | 0 |
| 0.9263888888888889 | 0 |
| 0.9270833333333334 | 0 |
| 0.9277777777777777 | 0 |
| 0.9284722222222223 | 0 |
| 0.9291666666666667 | 0 |
| 0.9298611111111111 | 0 |
| 0.9305555555555555 | 0 |
| 0.93125 | 0 |
| 0.9319444444444445 | 0 |
| 0.9326388888888889 | 0 |
| 0.9333333333333332 | 0 |
| 0.9340277777777778 | 0 |
| 0.9347222222222222 | 0 |
| 0.9354166666666667 | 0 |
| 0.936111111111111 | 0 |
| 0.9368055555555556 | 0 |
| 0.9375 | 0 |
| 0.9381944444444444 | 0 |
| 0.938888888888889 | 0 |
| 0.9395833333333333 | 0 |
| 0.9402777777777778 | 0 |
| 0.9409722222222222 | 0 |
| 0.9416666666666668 | 0 |
| 0.9423611111111111 | 0 |
| 0.9430555555555555 | 0 |
| 0.94375 | 0 |
| 0.9444444444444445 | 0 |
| 0.9451388888888889 | 0 |
| 0.9458333333333333 | 0 |
| 0.9465277777777777 | 0 |
| 0.9472222222222223 | 0 |
| 0.9479166666666666 | 0 |
| 0.9486111111111111 | 0 |
| 0.9493055555555556 | 0 |
| 0.9500000000000001 | 0 |
| 0.9506944444444444 | 0 |
| 0.9513888888888888 | 0 |
| 0.9520833333333334 | 0 |
| 0.9527777777777778 | 0 |
| 0.9534722222222222 | 0 |
| 0.9541666666666666 | 0 |
| 0.9548611111111112 | 0 |
| 0.9555555555555556 | 0 |
| 0.9562499999999999 | 0 |
| 0.9569444444444444 | 0 |
| 0.9576388888888889 | 0 |
| 0.9583333333333334 | 0 |
| 0.9590277777777777 | 0 |
| 0.9597222222222223 | 0 |
| 0.9604166666666667 | 0 |
| 0.9611111111111111 | 0 |
| 0.9618055555555555 | 0 |
| 0.9625 | 0 |
| 0.9631944444444445 | 0 |
| 0.9638888888888889 | 0 |
| 0.9645833333333332 | 0 |
| 0.9652777777777778 | 0 |
| 0.9659722222222222 | 0 |
| 0.9666666666666667 | 0 |
| 0.967361111111111 | 0 |
| 0.9680555555555556 | 0 |
| 0.96875 | 0 |
| 0.9694444444444444 | 0 |
| 0.970138888888889 | 0 |
| 0.9708333333333333 | 0 |
| 0.9715277777777778 | 0 |
| 0.9722222222222222 | 0 |
| 0.9729166666666668 | 0 |
| 0.9736111111111111 | 0 |
| 0.9743055555555555 | 0 |
| 0.975 | 0 |
| 0.9756944444444445 | 0 |
| 0.9763888888888889 | 0 |
| 0.9770833333333333 | 0 |
| 0.9777777777777777 | 0 |
| 0.9784722222222223 | 0 |
| 0.9791666666666666 | 0 |
| 0.9798611111111111 | 0 |
| 0.9805555555555556 | 0 |
| 0.9812500000000001 | 0 |
| 0.9819444444444444 | 0 |
| 0.9826388888888888 | 0 |
| 0.9833333333333334 | 0 |
| 0.9840277777777778 | 0 |
| 0.9847222222222222 | 0 |
| 0.9854166666666666 | 0 |
| 0.9861111111111112 | 0 |
| 0.9868055555555556 | 0 |
| 0.9874999999999999 | 0 |
| 0.9881944444444444 | 0 |
| 0.9888888888888889 | 0 |
| 0.9895833333333334 | 0 |
| 0.9902777777777777 | 0 |
| 0.9909722222222223 | 0 |
| 0.9916666666666667 | 0 |
| 0.9923611111111111 | 0 |
| 0.9930555555555555 | 0 |
| 0.99375 | 0 |
| 0.9944444444444445 | 0 |
| 0.9951388888888889 | 0 |
| 0.9958333333333332 | 0 |
| 0.9965277777777778 | 0 |
| 0.9972222222222222 | 0 |
| 0.9979166666666667 | 0 |
| 0.998611111111111 | 0 |
| 0.9993055555555556 | 0 |